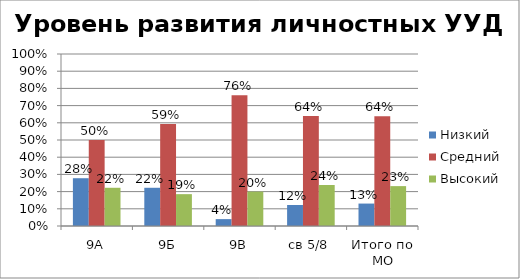
| Category | Низкий | Средний | Высокий |
|---|---|---|---|
| 9А | 0.278 | 0.5 | 0.222 |
| 9Б | 0.222 | 0.593 | 0.185 |
| 9В | 0.04 | 0.76 | 0.2 |
| св 5/8 | 0.122 | 0.64 | 0.238 |
| Итого по МО | 0.13 | 0.638 | 0.232 |